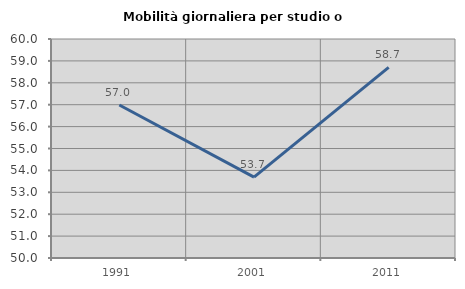
| Category | Mobilità giornaliera per studio o lavoro |
|---|---|
| 1991.0 | 56.988 |
| 2001.0 | 53.691 |
| 2011.0 | 58.702 |